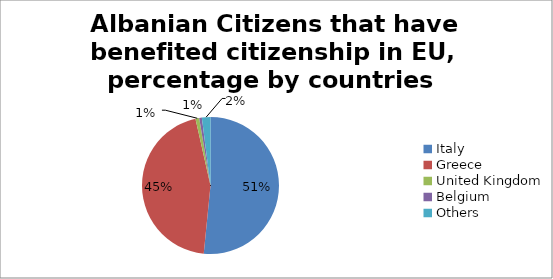
| Category | Albanian Citizens that have benefited citizenship in EU, percentage by countries  2014 |
|---|---|
| Italy | 51.577 |
| Greece | 44.897 |
| United Kingdom | 0.883 |
| Belgium | 0.624 |
| Others | 2.019 |